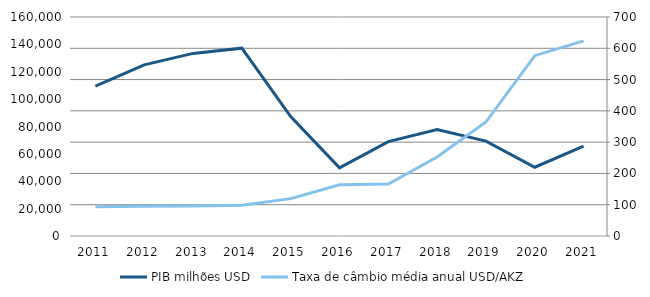
| Category | PIB milhões USD |
|---|---|
| 2011.0 | 109436.567 |
| 2012.0 | 124998.211 |
| 2013.0 | 133401.583 |
| 2014.0 | 137244.439 |
| 2015.0 | 87219.3 |
| 2016.0 | 49840.491 |
| 2017.0 | 68972.769 |
| 2018.0 | 77792.944 |
| 2019.0 | 69309.11 |
| 2020.0 | 50241.368 |
| 2021.0 | 65685.435 |